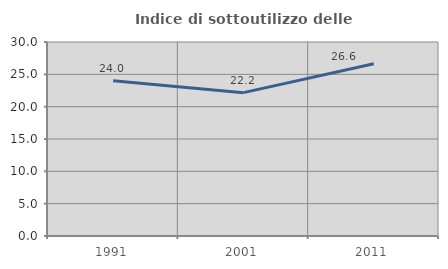
| Category | Indice di sottoutilizzo delle abitazioni  |
|---|---|
| 1991.0 | 24.012 |
| 2001.0 | 22.166 |
| 2011.0 | 26.645 |